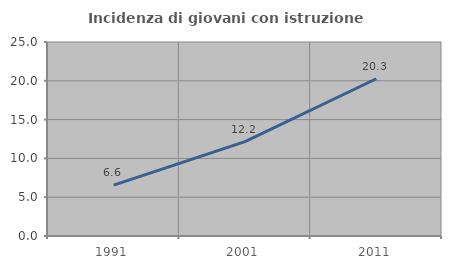
| Category | Incidenza di giovani con istruzione universitaria |
|---|---|
| 1991.0 | 6.553 |
| 2001.0 | 12.153 |
| 2011.0 | 20.265 |